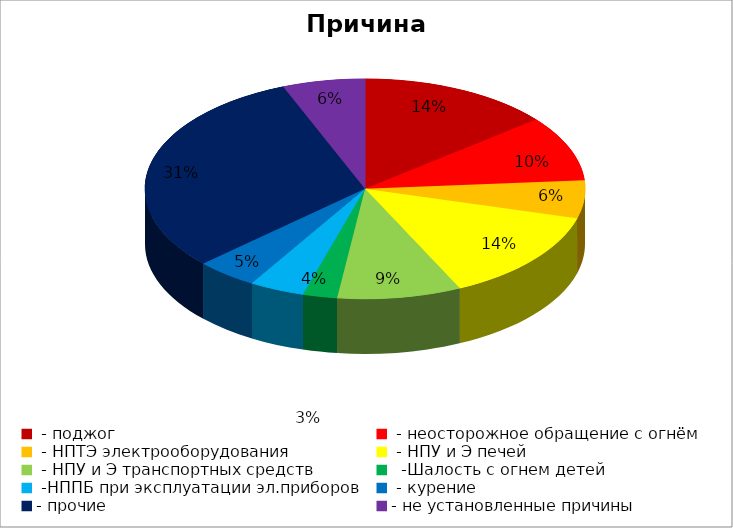
| Category | Причина пожара |
|---|---|
|  - поджог | 28 |
|  - неосторожное обращение с огнём | 19 |
|  - НПТЭ электрооборудования | 11 |
|  - НПУ и Э печей | 27 |
|  - НПУ и Э транспортных средств | 18 |
|   -Шалость с огнем детей | 5 |
|  -НППБ при эксплуатации эл.приборов | 8 |
|  - курение | 9 |
| - прочие | 61 |
| - не установленные причины | 12 |